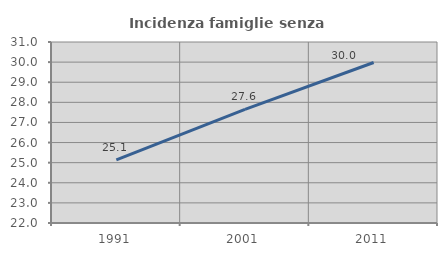
| Category | Incidenza famiglie senza nuclei |
|---|---|
| 1991.0 | 25.135 |
| 2001.0 | 27.646 |
| 2011.0 | 29.98 |